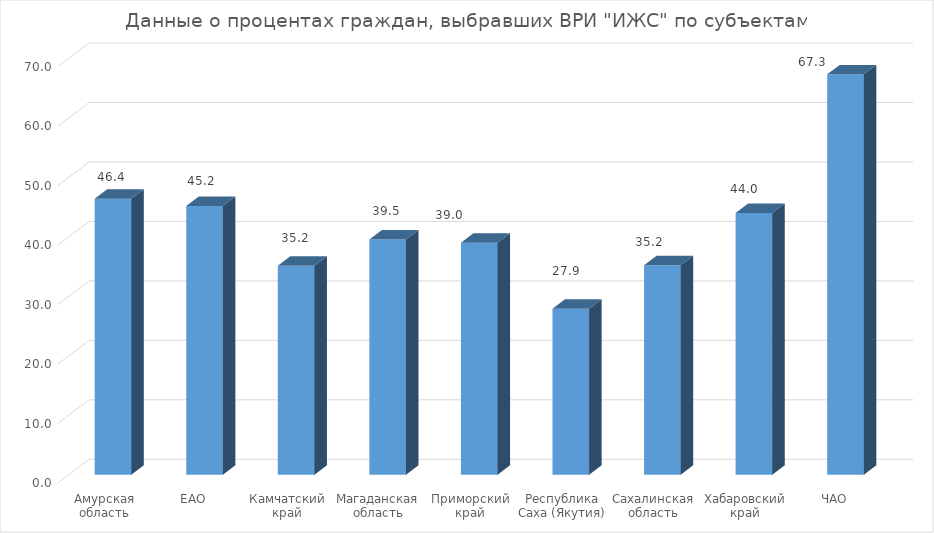
| Category | ИЖС |
|---|---|
| Амурская область | 46.413 |
| ЕАО | 45.179 |
| Камчатский край | 35.156 |
| Магаданская область | 39.548 |
| Приморский край | 39.028 |
| Республика Саха (Якутия) | 27.917 |
| Сахалинская область | 35.241 |
| Хабаровский край | 44.014 |
| ЧАО | 67.323 |